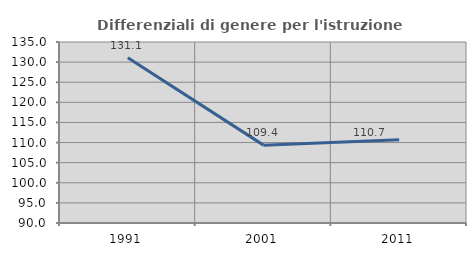
| Category | Differenziali di genere per l'istruzione superiore |
|---|---|
| 1991.0 | 131.07 |
| 2001.0 | 109.358 |
| 2011.0 | 110.697 |